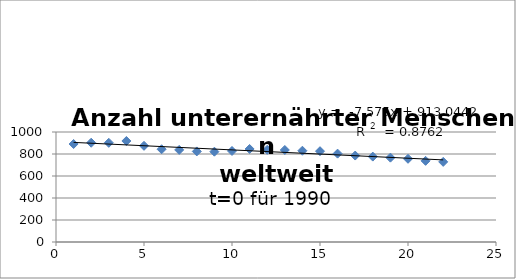
| Category | Series 0 |
|---|---|
| 1.0 | 890.8 |
| 2.0 | 902.5 |
| 3.0 | 901.6 |
| 4.0 | 918.3 |
| 5.0 | 874.4 |
| 6.0 | 843.3 |
| 7.0 | 837.2 |
| 8.0 | 823.4 |
| 9.0 | 821.1 |
| 10.0 | 827.6 |
| 11.0 | 845.7 |
| 12.0 | 837.8 |
| 13.0 | 836.6 |
| 14.0 | 829.7 |
| 15.0 | 825.5 |
| 16.0 | 803.4 |
| 17.0 | 785.9 |
| 18.0 | 776.4 |
| 19.0 | 766.8 |
| 20.0 | 756.4 |
| 21.0 | 737.7 |
| 22.0 | 728.4 |